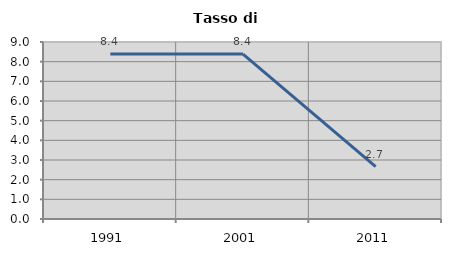
| Category | Tasso di disoccupazione   |
|---|---|
| 1991.0 | 8.387 |
| 2001.0 | 8.387 |
| 2011.0 | 2.667 |